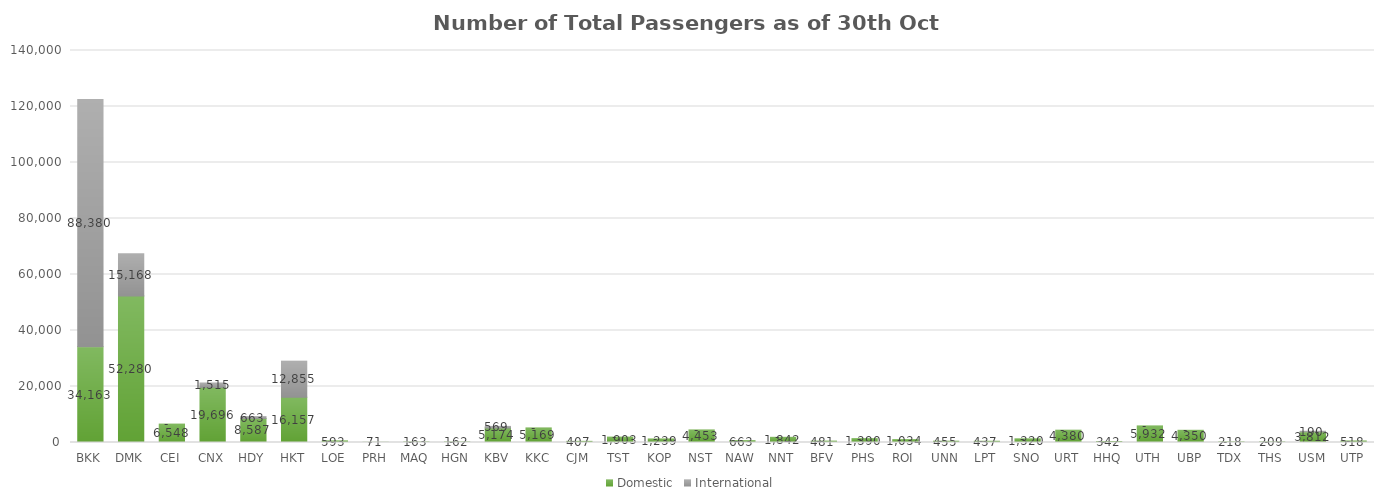
| Category | Domestic | International |
|---|---|---|
| BKK | 34163 | 88380 |
| DMK | 52280 | 15168 |
| CEI | 6548 | 0 |
| CNX | 19696 | 1515 |
| HDY | 8587 | 663 |
| HKT | 16157 | 12855 |
| LOE | 593 | 0 |
| PRH | 71 | 0 |
| MAQ | 163 | 0 |
| HGN | 162 | 0 |
| KBV | 5174 | 569 |
| KKC | 5169 | 0 |
| CJM | 407 | 0 |
| TST | 1903 | 0 |
| KOP | 1239 | 0 |
| NST | 4453 | 0 |
| NAW | 663 | 0 |
| NNT | 1842 | 0 |
| BFV | 481 | 0 |
| PHS | 1390 | 0 |
| ROI | 1034 | 0 |
| UNN | 455 | 0 |
| LPT | 437 | 0 |
| SNO | 1320 | 0 |
| URT | 4380 | 0 |
| HHQ | 342 | 0 |
| UTH | 5932 | 0 |
| UBP | 4350 | 0 |
| TDX | 218 | 0 |
| THS | 209 | 0 |
| USM | 3812 | 190 |
| UTP | 518 | 0 |